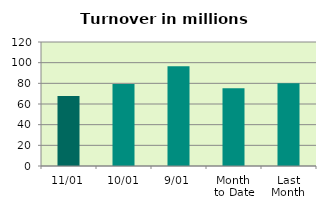
| Category | Series 0 |
|---|---|
| 11/01 | 67.693 |
| 10/01 | 79.298 |
| 9/01 | 96.439 |
| Month 
to Date | 75.31 |
| Last
Month | 79.992 |